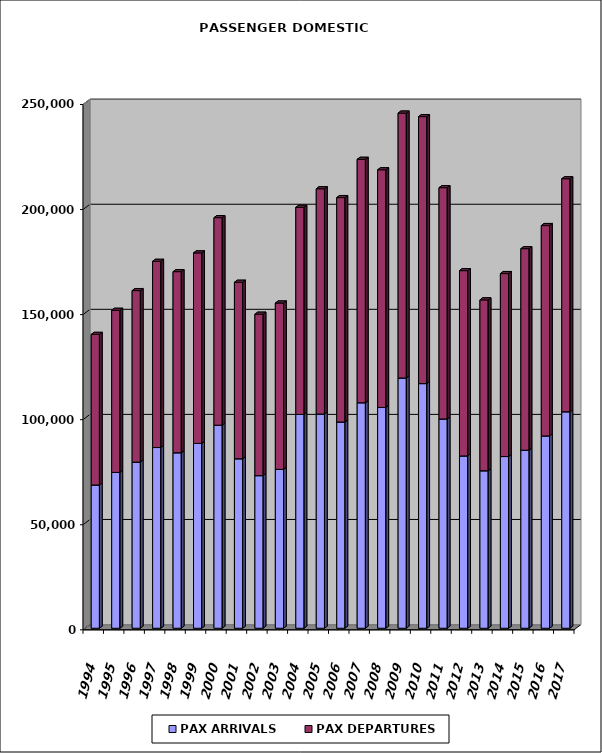
| Category | PAX ARRIVALS | PAX DEPARTURES |
|---|---|---|
| 1994.0 | 68174 | 71642 |
| 1995.0 | 74161 | 77121 |
| 1996.0 | 79067 | 81600 |
| 1997.0 | 85999 | 88588 |
| 1998.0 | 83515 | 86175 |
| 1999.0 | 87957 | 90641 |
| 2000.0 | 96621 | 98758 |
| 2001.0 | 80652 | 83978 |
| 2002.0 | 72622 | 76814 |
| 2003.0 | 75599 | 79144 |
| 2004.0 | 101736 | 98558 |
| 2005.0 | 101931 | 107193 |
| 2006.0 | 98157 | 106768 |
| 2007.0 | 107313 | 115813 |
| 2008.0 | 105068 | 113086 |
| 2009.0 | 119117 | 126018 |
| 2010.0 | 116422 | 127031 |
| 2011.0 | 99593 | 110068 |
| 2012.0 | 82004 | 88157 |
| 2013.0 | 74951 | 81295 |
| 2014.0 | 81704 | 87054 |
| 2015.0 | 84725 | 95893 |
| 2016.0 | 91528 | 100083 |
| 2017.0 | 103015 | 110888 |